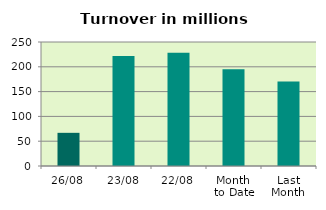
| Category | Series 0 |
|---|---|
| 26/08 | 66.873 |
| 23/08 | 221.673 |
| 22/08 | 228.346 |
| Month 
to Date | 195.064 |
| Last
Month | 170.387 |